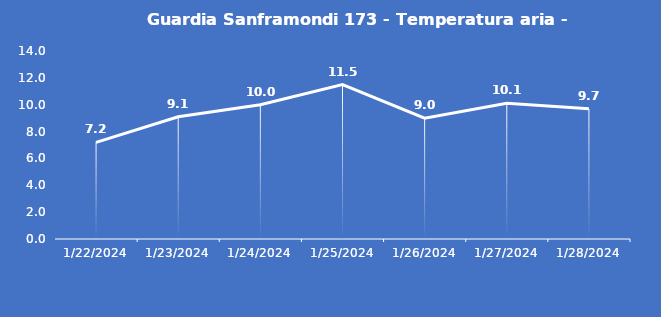
| Category | Guardia Sanframondi 173 - Temperatura aria - Grezzo (°C) |
|---|---|
| 1/22/24 | 7.2 |
| 1/23/24 | 9.1 |
| 1/24/24 | 10 |
| 1/25/24 | 11.5 |
| 1/26/24 | 9 |
| 1/27/24 | 10.1 |
| 1/28/24 | 9.7 |